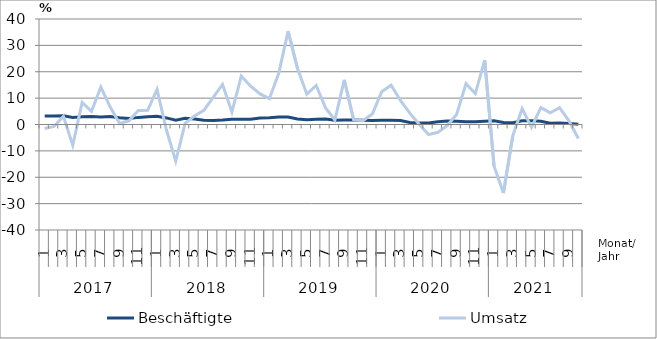
| Category | Beschäftigte | Umsatz |
|---|---|---|
| 0 | 3.2 | -1.5 |
| 1 | 3.2 | -0.7 |
| 2 | 3.3 | 3.1 |
| 3 | 2.7 | -7.9 |
| 4 | 2.9 | 8.4 |
| 5 | 3 | 5 |
| 6 | 2.8 | 14.2 |
| 7 | 3 | 6.6 |
| 8 | 2.6 | 0.4 |
| 9 | 2.3 | 1.4 |
| 10 | 2.7 | 5.3 |
| 11 | 2.9 | 5.4 |
| 12 | 3.1 | 13.3 |
| 13 | 2.5 | -2 |
| 14 | 1.6 | -13.9 |
| 15 | 2.4 | 0.4 |
| 16 | 2.1 | 3.2 |
| 17 | 1.6 | 5.4 |
| 18 | 1.5 | 10.3 |
| 19 | 1.7 | 15.2 |
| 20 | 2 | 4.7 |
| 21 | 2 | 18.4 |
| 22 | 2 | 14.5 |
| 23 | 2.5 | 11.6 |
| 24 | 2.6 | 9.8 |
| 25 | 2.8 | 19.4 |
| 26 | 2.8 | 35.4 |
| 27 | 2.1 | 21.3 |
| 28 | 1.8 | 11.5 |
| 29 | 2 | 14.8 |
| 30 | 2.1 | 6.3 |
| 31 | 1.6 | 1.7 |
| 32 | 1.7 | 16.9 |
| 33 | 1.7 | 1.8 |
| 34 | 1.6 | 1.4 |
| 35 | 1.5 | 4 |
| 36 | 1.6 | 12.4 |
| 37 | 1.6 | 14.9 |
| 38 | 1.5 | 9.1 |
| 39 | 0.8 | 4.3 |
| 40 | 0.6 | 0.1 |
| 41 | 0.6 | -3.8 |
| 42 | 1 | -3 |
| 43 | 1.3 | -0.4 |
| 44 | 1.2 | 3.8 |
| 45 | 1 | 15.5 |
| 46 | 1 | 11.7 |
| 47 | 1.2 | 24.4 |
| 48 | 1.4 | -15.8 |
| 49 | 0.8 | -26 |
| 50 | 0.7 | -4.3 |
| 51 | 1.4 | 6 |
| 52 | 1.4 | -1.1 |
| 53 | 1.2 | 6.4 |
| 54 | 0.5 | 4.4 |
| 55 | 0.6 | 6.4 |
| 56 | 0.4 | 1.4 |
| 57 | 0.1 | -5.3 |